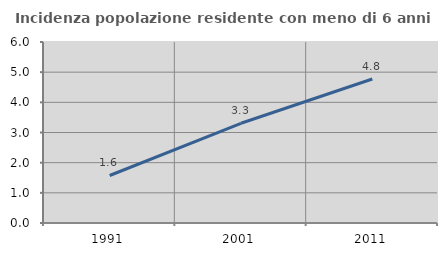
| Category | Incidenza popolazione residente con meno di 6 anni |
|---|---|
| 1991.0 | 1.575 |
| 2001.0 | 3.306 |
| 2011.0 | 4.775 |